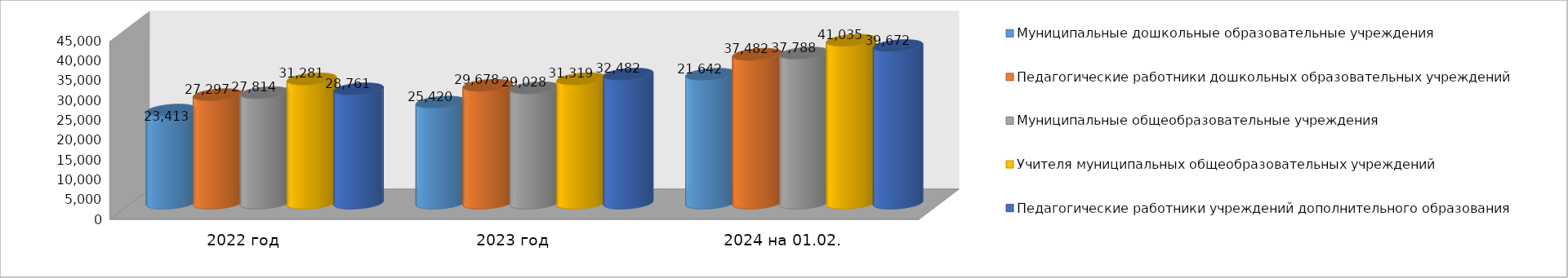
| Category | Муниципальные дошкольные образовательные учреждения | Педагогические работники дошкольных образовательных учреждений | Муниципальные общеобразовательные учреждения | Учителя муниципальных общеобразовательных учреждений | Педагогические работники учреждений дополнительного образования |
|---|---|---|---|---|---|
| 2022 год | 23413 | 27297 | 27814 | 31281 | 28761 |
| 2023 год | 25420 | 29678 | 29028 | 31319 | 32482 |
| 2024 на 01.02. | 32465 | 37482 | 37788 | 41035 | 39672 |